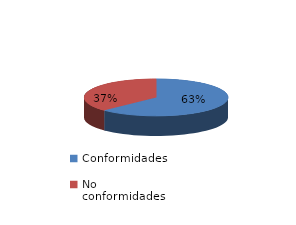
| Category | Series 0 |
|---|---|
| Conformidades | 1908 |
| No conformidades | 1137 |